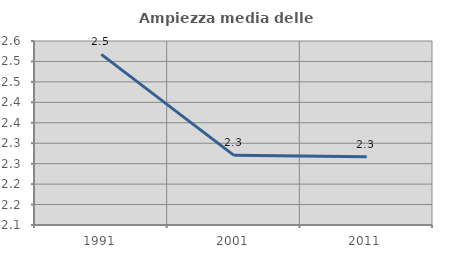
| Category | Ampiezza media delle famiglie |
|---|---|
| 1991.0 | 2.517 |
| 2001.0 | 2.27 |
| 2011.0 | 2.267 |